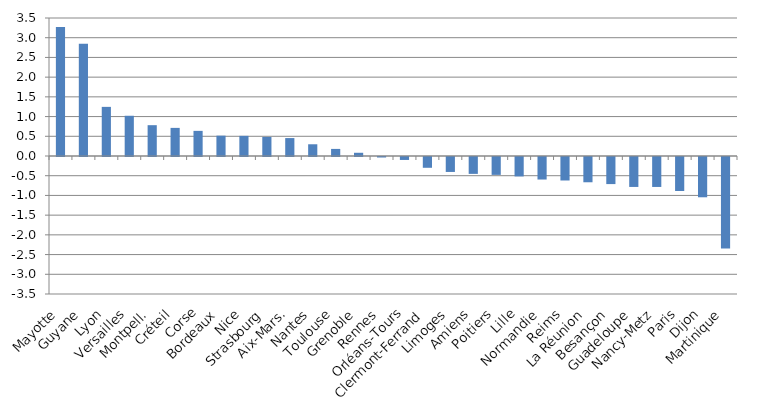
| Category | Évolution en % |
|---|---|
| Mayotte | 3.269 |
| Guyane | 2.845 |
| Lyon | 1.246 |
| Versailles | 1.021 |
| Montpell. | 0.782 |
| Créteil | 0.713 |
| Corse | 0.637 |
| Bordeaux | 0.516 |
| Nice | 0.511 |
| Strasbourg | 0.484 |
| Aix-Mars. | 0.455 |
| Nantes | 0.297 |
| Toulouse | 0.18 |
| Grenoble | 0.082 |
| Rennes | -0.013 |
| Orléans-Tours | -0.075 |
| Clermont-Ferrand | -0.274 |
| Limoges | -0.379 |
| Amiens | -0.428 |
| Poitiers | -0.453 |
| Lille | -0.493 |
| Normandie | -0.571 |
| Reims | -0.596 |
| La Réunion | -0.641 |
| Besançon | -0.687 |
| Guadeloupe | -0.759 |
| Nancy-Metz  | -0.76 |
| Paris | -0.862 |
| Dijon | -1.022 |
| Martinique | -2.32 |